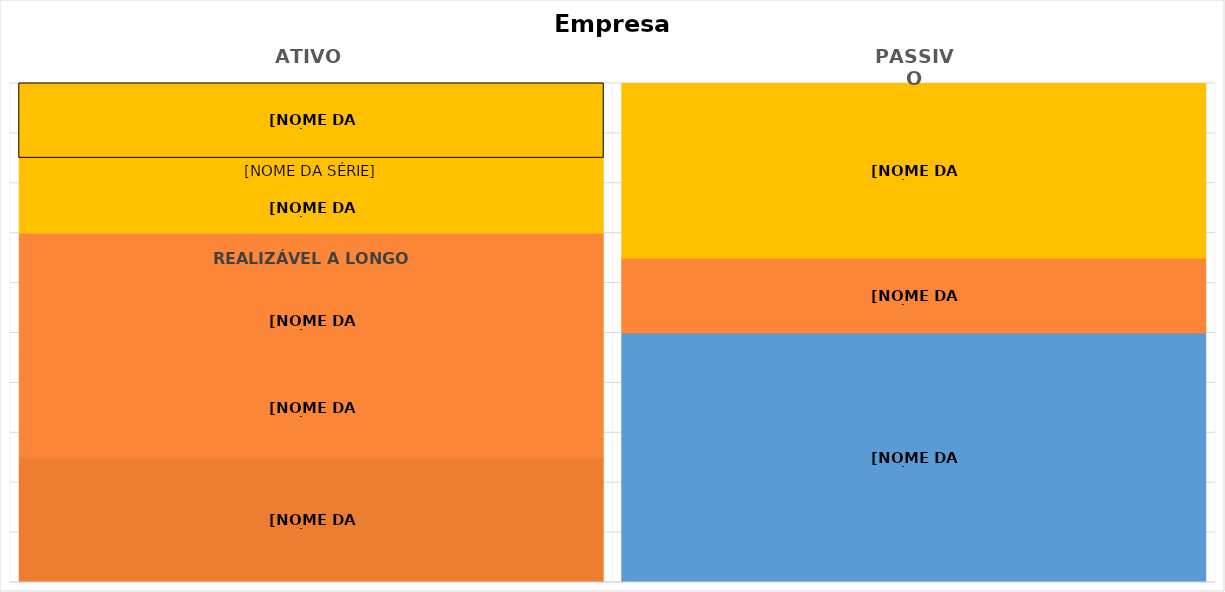
| Category | INTANGÍVEL | IMOBILIZADO | INVESTIMENTOS | REALIZÁVEL A LONGO PRAZO | PATRIMÔNIO LÍQUIDO | ESTOQUES | CLIENTES | NÃO CIRCULANTE | CIRCULANTE | DISPONÍVEL |
|---|---|---|---|---|---|---|---|---|---|---|
| ATIVO | 500 | 400 | 300 | 200 | 0 | 200 | 100 | 0 | 0 | 300 |
| PASSIVO | 0 | 0 | 0 | 0 | 1000 | 0 | 0 | 300 | 700 | 0 |